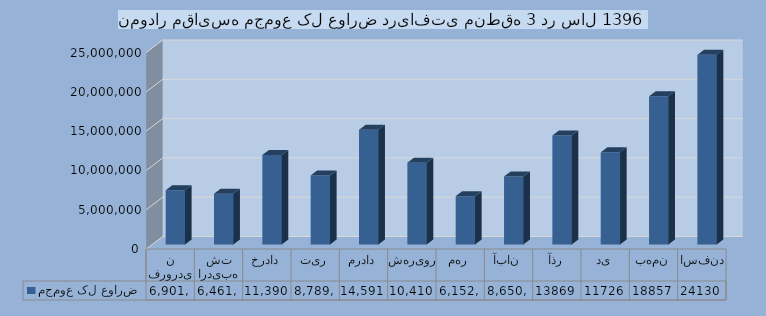
| Category | مجموع کل عوارض |
|---|---|
| فروردین | 6901195 |
| اردیبهشت | 6461498 |
| خرداد | 11390608 |
| تیر | 8789157 |
| مرداد | 14591597 |
| شهریور | 10410735 |
| مهر | 6152300 |
| آبان | 8650411 |
| آذر | 13869776 |
| دی | 11726609 |
| بهمن | 18857368 |
| اسفند | 24130460 |